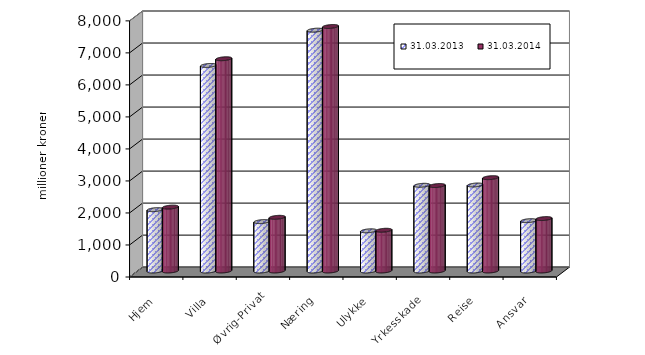
| Category | 31.03.2013 | 31.03.2014 |
|---|---|---|
| Hjem | 1916.48 | 1995.718 |
| Villa | 6419.858 | 6629.55 |
| Øvrig-Privat | 1543.611 | 1676.82 |
| Næring | 7521.795 | 7636.647 |
| Ulykke | 1255.204 | 1272.547 |
| Yrkesskade | 2676.984 | 2669.472 |
| Reise | 2685.962 | 2915.651 |
| Ansvar | 1572.13 | 1637.616 |